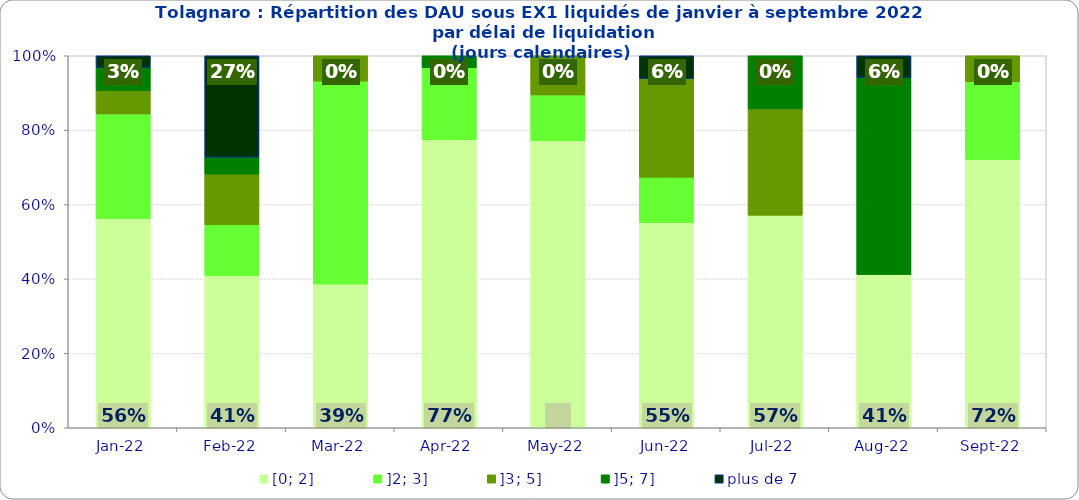
| Category | [0; 2] | ]2; 3] | ]3; 5] | ]5; 7] | plus de 7 |
|---|---|---|---|---|---|
| 2022-01-01 | 0.562 | 0.281 | 0.062 | 0.062 | 0.031 |
| 2022-02-01 | 0.409 | 0.136 | 0.136 | 0.045 | 0.273 |
| 2022-03-01 | 0.386 | 0.545 | 0.068 | 0 | 0 |
| 2022-04-01 | 0.774 | 0.194 | 0 | 0.032 | 0 |
| 2022-05-01 | 0.772 | 0.123 | 0.105 | 0 | 0 |
| 2022-06-01 | 0.551 | 0.122 | 0.265 | 0 | 0.061 |
| 2022-07-01 | 0.571 | 0 | 0.286 | 0.143 | 0 |
| 2022-08-01 | 0.412 | 0 | 0 | 0.529 | 0.059 |
| 2022-09-01 | 0.721 | 0.209 | 0.07 | 0 | 0 |